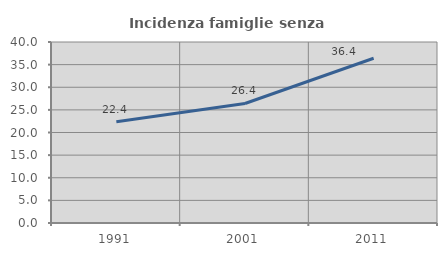
| Category | Incidenza famiglie senza nuclei |
|---|---|
| 1991.0 | 22.357 |
| 2001.0 | 26.411 |
| 2011.0 | 36.408 |